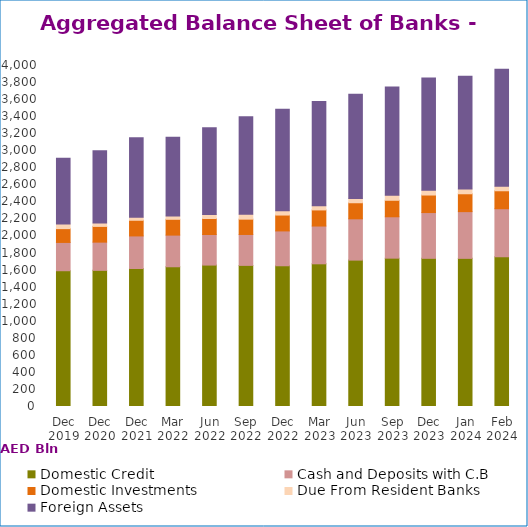
| Category | Domestic Credit | Cash and Deposits with C.B | Domestic Investments | Due From Resident Banks | Foreign Assets |
|---|---|---|---|---|---|
| Dec 2019 | 1592609 | 331901 | 161964 | 53115 | 771092 |
| Dec 2020 | 1596786 | 331248 | 184500 | 39723 | 849077 |
| Dec 2021 | 1618957 | 381878 | 183560 | 35897 | 933169 |
| Mar 2022 | 1639109 | 371316 | 185482 | 39758 | 923237 |
| Jun 2022 | 1658863 | 358768 | 187809 | 46197 | 1017215 |
| Sep 2022 | 1655408 | 362543 | 179698 | 56397 | 1144270 |
| Dec 2022 | 1650937 | 408573 | 186306 | 49988 | 1191027 |
| Mar 2023 | 1673785 | 443035 | 189046 | 48911 | 1221886 |
| Jun 2023 | 1717116 | 484500 | 188428 | 50805 | 1220740 |
| Sep 2023 | 1740086 | 485417 | 193477 | 58336 | 1270026 |
| Dec 2023 | 1738043 | 536959 | 205653 | 57089 | 1316925 |
| Jan 2024 | 1737697 | 548152 | 209515 | 54994 | 1323600 |
| Feb 2024 | 1756497 | 563469 | 210676 | 52515 | 1371634 |